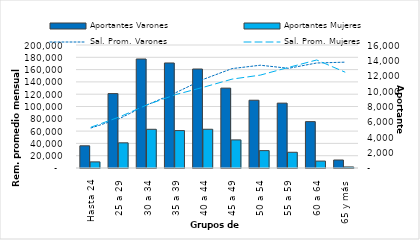
| Category | Aportantes Varones | Aportantes Mujeres |
|---|---|---|
| Hasta 24 | 2888 | 795 |
| 25 a 29 | 9677 | 3274 |
| 30 a 34 | 14177 | 5035 |
| 35 a 39 | 13661 | 4867 |
| 40 a 44 | 12876 | 5040 |
| 45 a 49 | 10390 | 3656 |
| 50 a 54 | 8817 | 2261 |
| 55 a 59 | 8439 | 2046 |
| 60 a 64 | 6032 | 902 |
| 65 y más | 1040 | 138 |